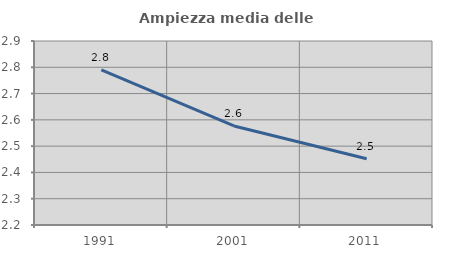
| Category | Ampiezza media delle famiglie |
|---|---|
| 1991.0 | 2.791 |
| 2001.0 | 2.577 |
| 2011.0 | 2.452 |